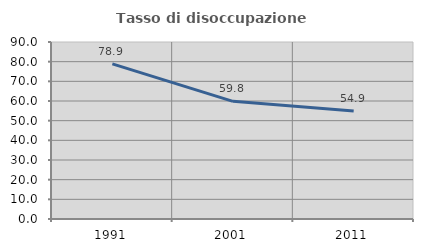
| Category | Tasso di disoccupazione giovanile  |
|---|---|
| 1991.0 | 78.889 |
| 2001.0 | 59.813 |
| 2011.0 | 54.938 |